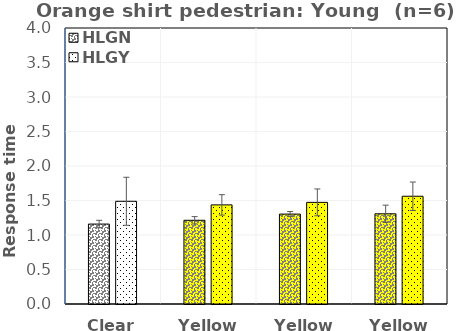
| Category | HLGN | HLGY |
|---|---|---|
| Clear | 1.158 | 1.489 |
| Yellow1 | 1.213 | 1.436 |
| Yellow2 | 1.303 | 1.473 |
| Yellow3 | 1.307 | 1.562 |